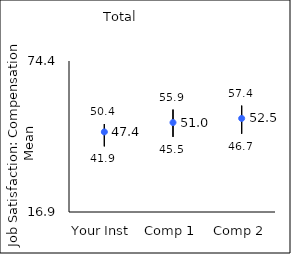
| Category | 25th percentile | 75th percentile | Mean |
|---|---|---|---|
| Your Inst | 41.9 | 50.4 | 47.39 |
| Comp 1 | 45.5 | 55.9 | 50.97 |
| Comp 2 | 46.7 | 57.4 | 52.54 |